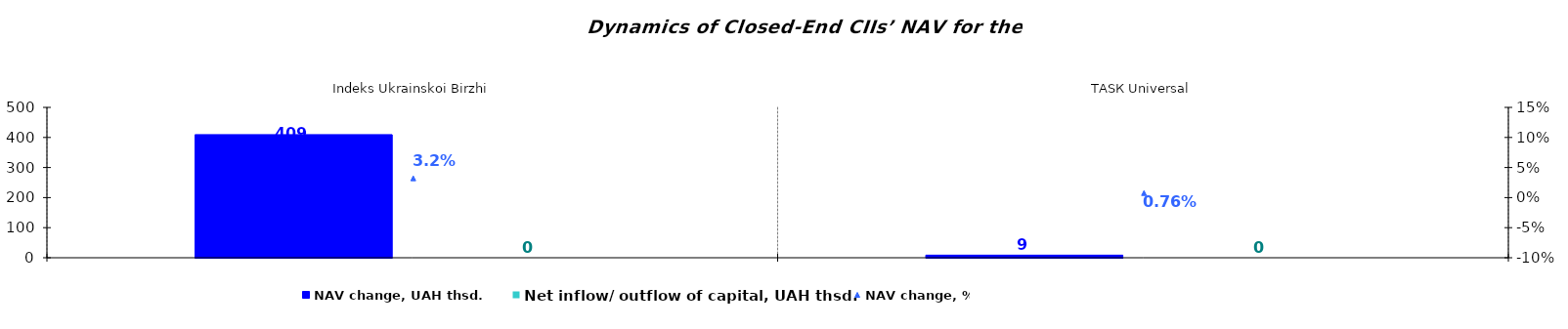
| Category | NAV change, UAH thsd. | Net inflow/ outflow of capital, UAH thsd. |
|---|---|---|
| Іndeks Ukrainskoi Birzhi | 409.361 | 0 |
| ТАSК Universal | 8.604 | 0 |